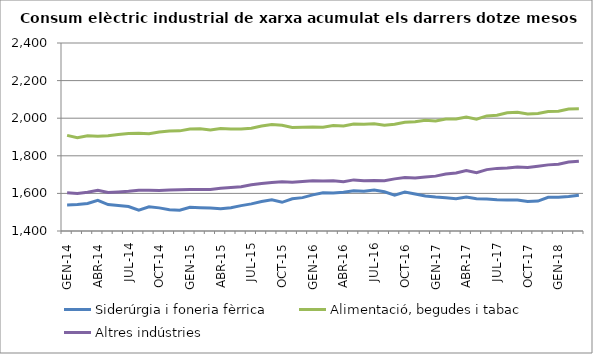
| Category | Siderúrgia i foneria fèrrica | Alimentació, begudes i tabac | Altres indústries |
|---|---|---|---|
| GEN-14 | 1538.594 | 1908.721 | 1603.542 |
| FEB-14 | 1540.421 | 1895.977 | 1599.033 |
| MAR-14 | 1546.092 | 1905.993 | 1606.534 |
| ABR-14 | 1562.916 | 1903.618 | 1616.906 |
| MAI-14 | 1540.518 | 1907.024 | 1605.39 |
| JUN-14 | 1536.225 | 1913.187 | 1608.032 |
| JUL-14 | 1530.088 | 1918.461 | 1611.455 |
| AGO-14 | 1510.505 | 1920.272 | 1616.548 |
| SET-14 | 1528.566 | 1917.071 | 1616.999 |
| OCT-14 | 1523.025 | 1926.253 | 1616.091 |
| NOV-14 | 1513.566 | 1932.214 | 1618.548 |
| DES-14 | 1510.245 | 1932.602 | 1619.753 |
| GEN-15 | 1526.498 | 1942.849 | 1621.031 |
| FEB-15 | 1523.983 | 1944.12 | 1620.328 |
| MAR-15 | 1521.802 | 1937.624 | 1620.36 |
| ABR-15 | 1518.823 | 1945.529 | 1627.715 |
| MAI-15 | 1524.227 | 1942.025 | 1631.14 |
| JUN-15 | 1535.042 | 1942.279 | 1635.482 |
| JUL-15 | 1544.173 | 1946.595 | 1645.656 |
| AGO-15 | 1556.894 | 1958.719 | 1653.02 |
| SET-15 | 1566.055 | 1966.36 | 1657.809 |
| OCT-15 | 1552.623 | 1962.187 | 1662.534 |
| NOV-15 | 1571.735 | 1951.096 | 1659.21 |
| DES-15 | 1577.421 | 1952.045 | 1663.637 |
| GEN-16 | 1592.055 | 1953.18 | 1667.888 |
| FEB-16 | 1603.526 | 1951.467 | 1665.417 |
| MAR-16 | 1602.085 | 1960.834 | 1667.286 |
| ABR-16 | 1605.704 | 1958.385 | 1661.556 |
| MAI-16 | 1613.834 | 1968.784 | 1671.813 |
| JUN-16 | 1611.742 | 1967.565 | 1667.005 |
| JUL-16 | 1617.745 | 1970.243 | 1668.791 |
| AGO-16 | 1608.357 | 1962.912 | 1667.693 |
| SET-16 | 1591.065 | 1967.327 | 1677.212 |
| OCT-16 | 1606.977 | 1978.146 | 1684.146 |
| NOV-16 | 1597.254 | 1980.865 | 1682.147 |
| DES-16 | 1586.429 | 1988.847 | 1687.43 |
| GEN-17 | 1580.652 | 1985.721 | 1691.899 |
| FEB-17 | 1576.911 | 1996.143 | 1702.867 |
| MAR-17 | 1571.022 | 1995.388 | 1708.928 |
| ABR-17 | 1580.772 | 2006.805 | 1721.382 |
| MAI-17 | 1571.518 | 1994.488 | 1709.841 |
| JUN-17 | 1570.244 | 2012.167 | 1726.446 |
| JUL-17 | 1566.541 | 2015.605 | 1733.096 |
| AGO-17 | 1565.263 | 2028.885 | 1734.869 |
| SET-17 | 1565.224 | 2032.124 | 1740.555 |
| OCT-17 | 1556.571 | 2022.067 | 1738.104 |
| NOV-17 | 1559.382 | 2025.469 | 1744.583 |
| DES-17 | 1579.563 | 2035.496 | 1751.716 |
| GEN-18 | 1579.571 | 2037.362 | 1755.229 |
| FEB-18 | 1583.757 | 2049.165 | 1766.441 |
| MAR-18 | 1590.671 | 2049.922 | 1771.206 |